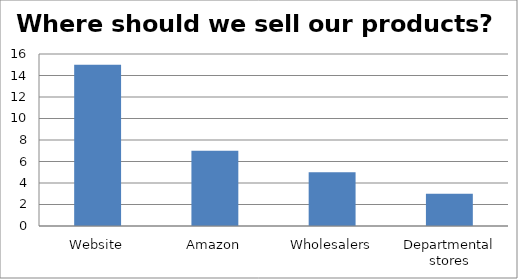
| Category | Series 0 |
|---|---|
| Website | 15 |
| Amazon | 7 |
| Wholesalers | 5 |
| Departmental stores | 3 |